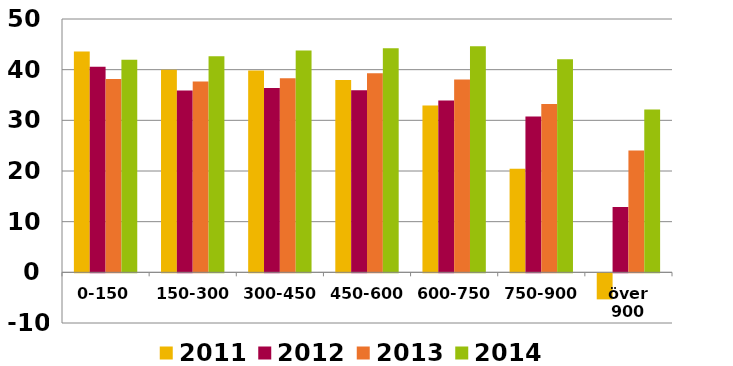
| Category | 2011 | 2012 | 2013 | 2014 |
|---|---|---|---|---|
| 0-150 | 43.609 | 40.557 | 38.151 | 41.954 |
| 150-300 | 39.962 | 35.881 | 37.673 | 42.626 |
| 300-450 | 39.842 | 36.373 | 38.324 | 43.776 |
| 450-600 | 37.978 | 35.954 | 39.285 | 44.229 |
| 600-750 | 32.906 | 33.934 | 38.06 | 44.615 |
| 750-900 | 20.448 | 30.742 | 33.206 | 42.072 |
| över 900 | -5.138 | 12.875 | 24.033 | 32.143 |